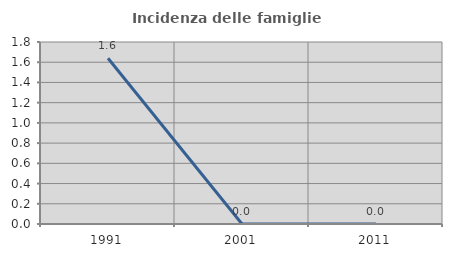
| Category | Incidenza delle famiglie numerose |
|---|---|
| 1991.0 | 1.639 |
| 2001.0 | 0 |
| 2011.0 | 0 |